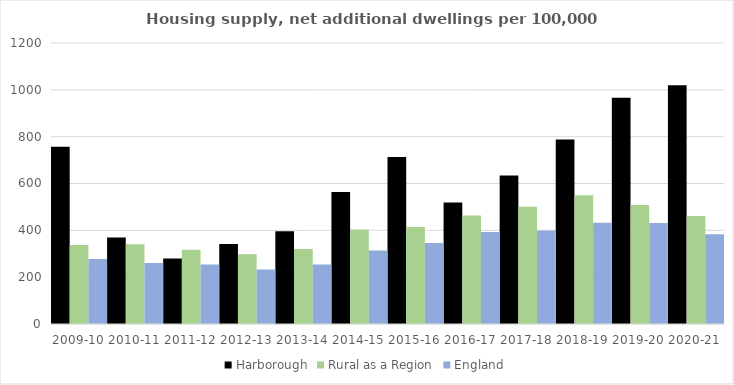
| Category | Harborough | Rural as a Region | England |
|---|---|---|---|
| 2009-10 | 756.637 | 337.852 | 277.548 |
| 2010-11 | 369.873 | 340.105 | 260.994 |
| 2011-12 | 280.05 | 317.04 | 254.007 |
| 2012-13 | 341.562 | 297.763 | 233.153 |
| 2013-14 | 395.763 | 319.835 | 253.602 |
| 2014-15 | 564.053 | 403.796 | 314.256 |
| 2015-16 | 713.452 | 414.091 | 346.154 |
| 2016-17 | 518.554 | 463.209 | 393.256 |
| 2017-18 | 634.15 | 500.68 | 399.646 |
| 2018-19 | 788.117 | 549.491 | 432.099 |
| 2019-20 | 965.813 | 508.493 | 431.187 |
| 2020-21 | 1019.5 | 461.114 | 382.827 |